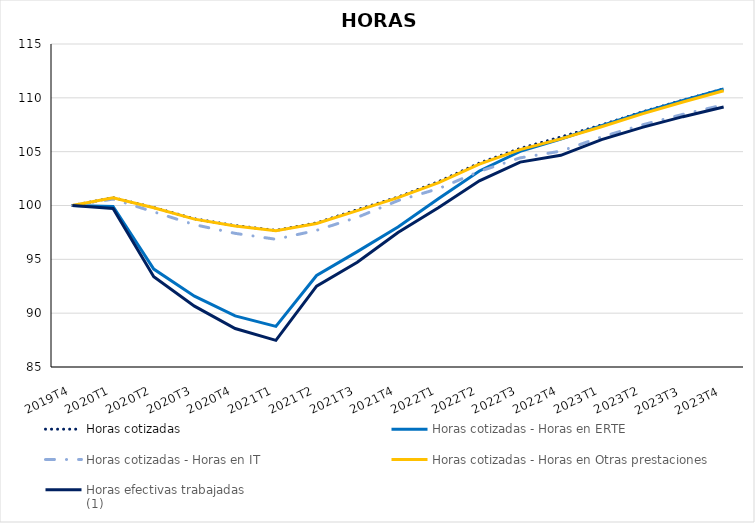
| Category | Horas cotizadas | Horas cotizadas - Horas en ERTE | Horas cotizadas - Horas en IT | Horas cotizadas - Horas en Otras prestaciones | Horas efectivas trabajadas
(1) |
|---|---|---|---|---|---|
|     2019T4 | 100 | 100 | 100 | 100 | 100 |
|     2020T1 | 100.723 | 99.906 | 100.596 | 100.713 | 99.728 |
|     2020T2 | 99.814 | 94.098 | 99.408 | 99.796 | 93.392 |
|     2020T3 | 98.763 | 91.576 | 98.22 | 98.736 | 90.652 |
|     2020T4 | 98.134 | 89.741 | 97.412 | 98.102 | 88.572 |
|     2021T1 | 97.689 | 88.77 | 96.865 | 97.659 | 87.476 |
|     2021T2 | 98.381 | 93.498 | 97.692 | 98.325 | 92.509 |
|     2021T3 | 99.611 | 95.719 | 98.9 | 99.523 | 94.722 |
|     2021T4 | 100.786 | 98.007 | 100.454 | 100.737 | 97.487 |
|     2022T1 | 102.221 | 100.646 | 101.569 | 102.127 | 99.814 |
|     2022T2 | 103.941 | 103.208 | 103.167 | 103.842 | 102.291 |
|     2022T3 | 105.298 | 105.032 | 104.424 | 105.192 | 104.028 |
|     2022T4 | 106.361 | 106.173 | 105.048 | 106.185 | 104.658 |
|     2023T1 | 107.48 | 107.422 | 106.365 | 107.309 | 106.117 |
|     2023T2 | 108.69 | 108.648 | 107.486 | 108.516 | 107.252 |
| 2023T3 | 109.785 | 109.755 | 108.468 | 109.616 | 108.25 |
| 2023T4 | 110.831 | 110.815 | 109.348 | 110.66 | 109.143 |